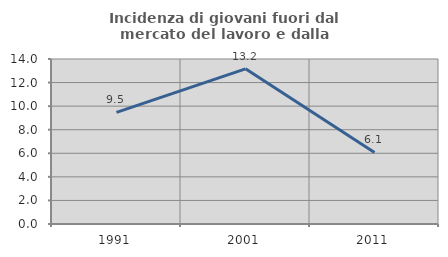
| Category | Incidenza di giovani fuori dal mercato del lavoro e dalla formazione  |
|---|---|
| 1991.0 | 9.474 |
| 2001.0 | 13.165 |
| 2011.0 | 6.071 |